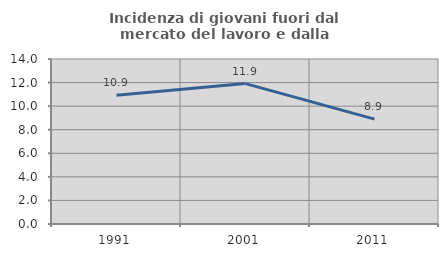
| Category | Incidenza di giovani fuori dal mercato del lavoro e dalla formazione  |
|---|---|
| 1991.0 | 10.916 |
| 2001.0 | 11.911 |
| 2011.0 | 8.902 |